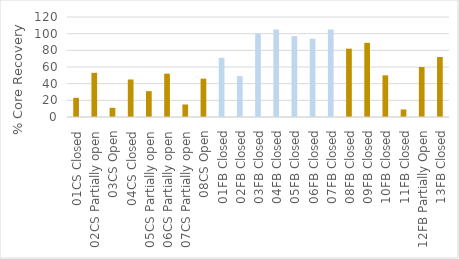
| Category | % Core Recovery |
|---|---|
| 01CS Closed | 23 |
| 02CS Partially open | 53 |
| 03CS Open | 11 |
| 04CS Closed | 45 |
| 05CS Partially open | 31 |
| 06CS Partially open | 52 |
| 07CS Partially open | 15 |
| 08CS Open | 46 |
| 01FB Closed | 71 |
| 02FB Closed | 49 |
| 03FB Closed | 100 |
| 04FB Closed | 105 |
| 05FB Closed | 97 |
| 06FB Closed | 94 |
| 07FB Closed | 105 |
| 08FB Closed | 82 |
| 09FB Closed | 89 |
| 10FB Closed | 50 |
| 11FB Closed | 9 |
| 12FB Partially Open | 60 |
| 13FB Closed | 72 |